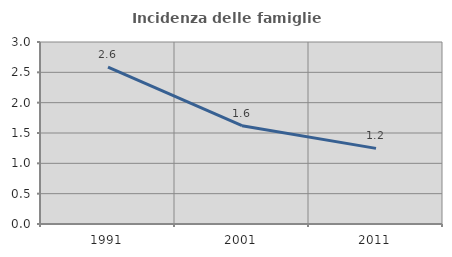
| Category | Incidenza delle famiglie numerose |
|---|---|
| 1991.0 | 2.586 |
| 2001.0 | 1.621 |
| 2011.0 | 1.247 |